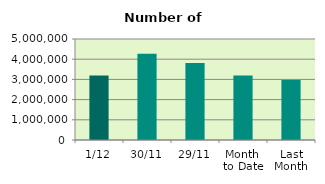
| Category | Series 0 |
|---|---|
| 1/12 | 3194590 |
| 30/11 | 4270684 |
| 29/11 | 3807574 |
| Month 
to Date | 3194590 |
| Last
Month | 2974168.364 |